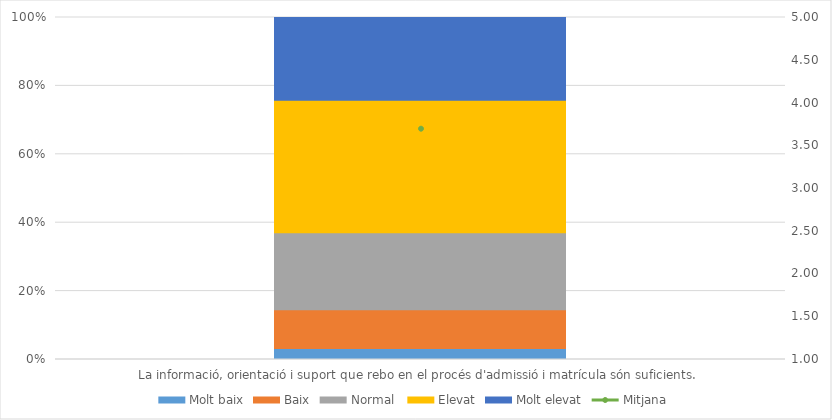
| Category | Molt baix | Baix | Normal  | Elevat | Molt elevat |
|---|---|---|---|---|---|
| La informació, orientació i suport que rebo en el procés d'admissió i matrícula són suficients. | 2 | 7 | 14 | 24 | 15 |